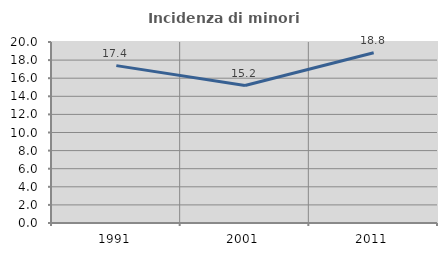
| Category | Incidenza di minori stranieri |
|---|---|
| 1991.0 | 17.391 |
| 2001.0 | 15.19 |
| 2011.0 | 18.817 |